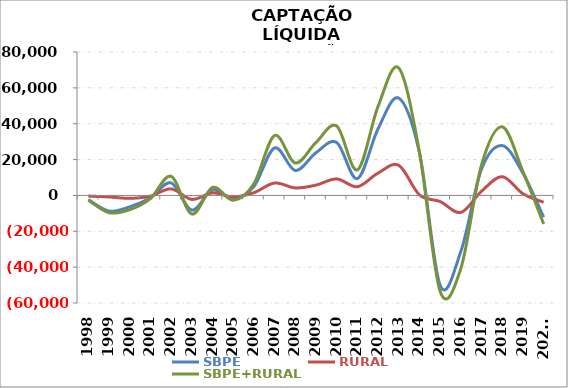
| Category | SBPE | RURAL | SBPE+RURAL |
|---|---|---|---|
| 1998 | -2301.5 | -361.228 | -2662.728 |
| 1999 | -8740.2 | -858.508 | -9598.708 |
| 2000 | -6355.964 | -1615.457 | -7971.421 |
| 2001 | -1319.381 | -412.963 | -1732.344 |
| 2002 | 7008.282 | 3649.972 | 10658.254 |
| 2003 | -8178.886 | -2213.868 | -10392.754 |
| 2004 | 3057.299 | 1425.147 | 4482.446 |
| 2005 | -1869.531 | -826.948 | -2696.479 |
| 2006 | 4963.736 | 1532.919 | 6496.655 |
| 2007 | 26493.6 | 6927.358 | 33420.958 |
| 2008 | 13900.71 | 4187.043 | 18087.753 |
| 2009 | 23813.033 | 5752.651 | 29565.684 |
| 2010 | 29513.472 | 9213.301 | 38726.773 |
| 2011 | 9382.932 | 4844.657 | 14227.589 |
| 2012 | 37239.575 | 12479.984 | 49719.559 |
| 2013 | 54280.749 | 16766.843 | 71047.592 |
| 2014 | 23758.558 | 275.423 | 24033.981 |
| 2015 | -50149.363 | -3418.504 | -53567.867 |
| 2016 | -31222.546 | -9479.207 | -40701.753 |
| 2017 | 14774.799 | 2351.903 | 17126.702 |
| 2018 | 27791.076 | 10469.293 | 38260.369 |
| 2019 | 12389.575 | 937.497 | 13327.072 |
| 2020* | -12105.725 | -3822.153 | -15927.878 |